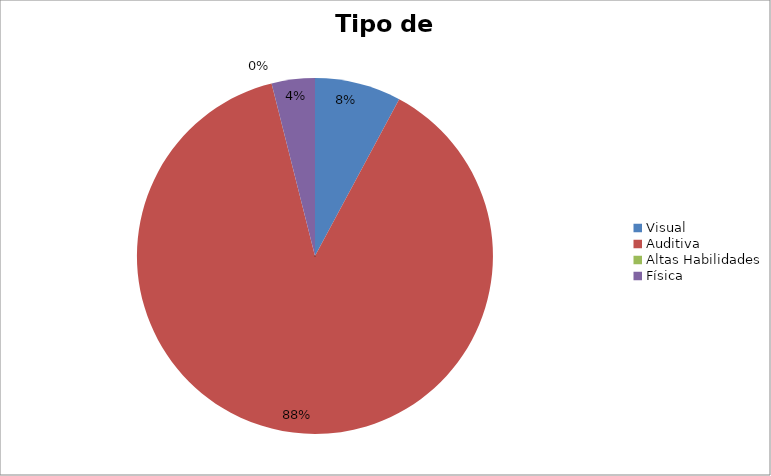
| Category | Quantitativo |
|---|---|
| Visual | 4 |
| Auditiva | 45 |
| Altas Habilidades | 0 |
| Física | 2 |